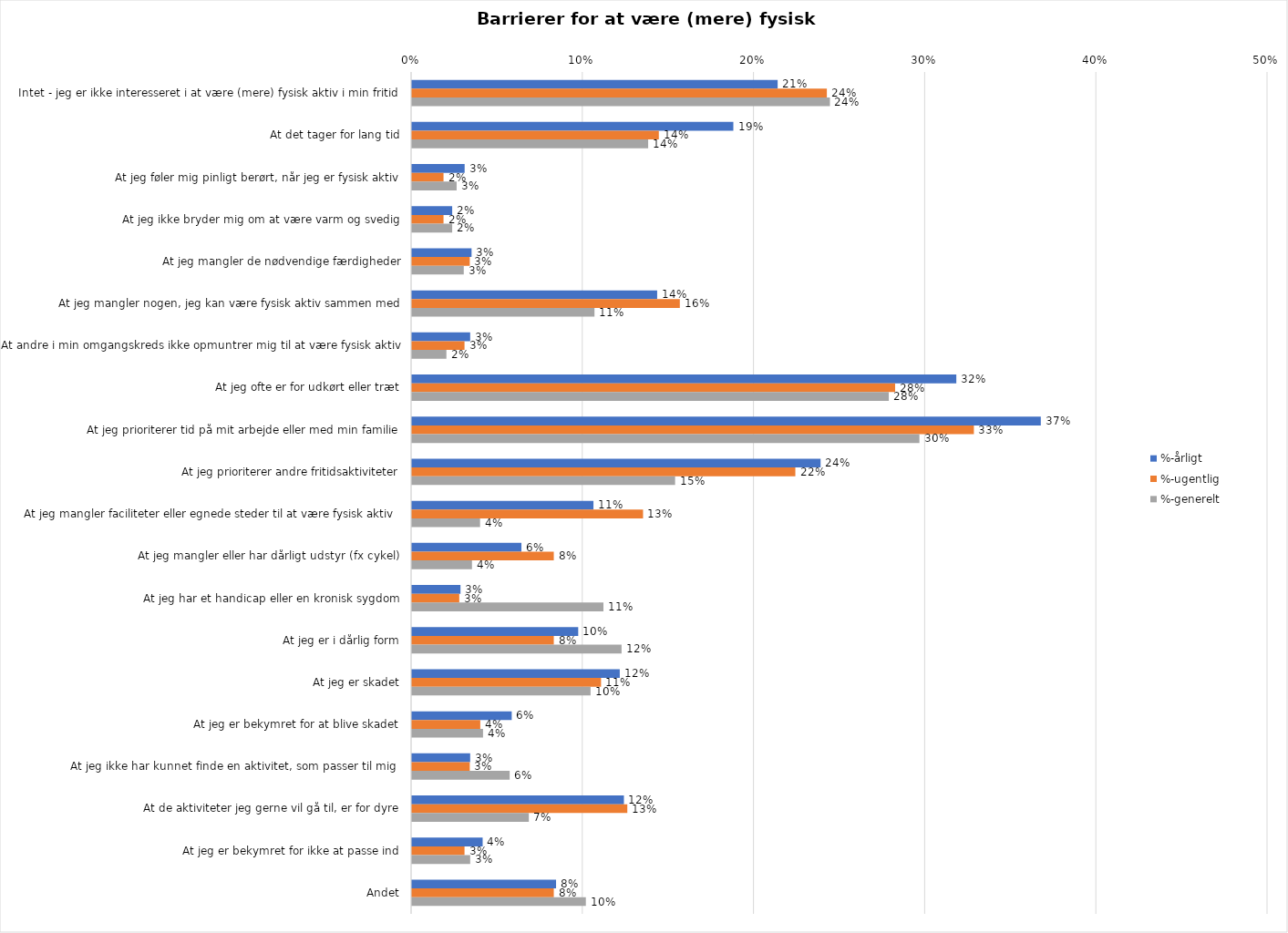
| Category | %-årligt | %-ugentlig | %-generelt |
|---|---|---|---|
| Intet - jeg er ikke interesseret i at være (mere) fysisk aktiv i min fritid | 0.214 | 0.242 | 0.244 |
| At det tager for lang tid | 0.188 | 0.144 | 0.138 |
| At jeg føler mig pinligt berørt, når jeg er fysisk aktiv | 0.031 | 0.018 | 0.026 |
| At jeg ikke bryder mig om at være varm og svedig | 0.023 | 0.018 | 0.023 |
| At jeg mangler de nødvendige færdigheder | 0.035 | 0.034 | 0.03 |
| At jeg mangler nogen, jeg kan være fysisk aktiv sammen med | 0.143 | 0.156 | 0.107 |
| At andre i min omgangskreds ikke opmuntrer mig til at være fysisk aktiv | 0.034 | 0.031 | 0.02 |
| At jeg ofte er for udkørt eller træt | 0.318 | 0.282 | 0.279 |
| At jeg prioriterer tid på mit arbejde eller med min familie | 0.367 | 0.328 | 0.296 |
| At jeg prioriterer andre fritidsaktiviteter | 0.239 | 0.224 | 0.154 |
| At jeg mangler faciliteter eller egnede steder til at være fysisk aktiv  | 0.106 | 0.135 | 0.04 |
| At jeg mangler eller har dårligt udstyr (fx cykel) | 0.064 | 0.083 | 0.035 |
| At jeg har et handicap eller en kronisk sygdom | 0.028 | 0.028 | 0.112 |
| At jeg er i dårlig form | 0.097 | 0.083 | 0.122 |
| At jeg er skadet | 0.121 | 0.11 | 0.104 |
| At jeg er bekymret for at blive skadet | 0.058 | 0.04 | 0.041 |
| At jeg ikke har kunnet finde en aktivitet, som passer til mig  | 0.034 | 0.034 | 0.057 |
| At de aktiviteter jeg gerne vil gå til, er for dyre | 0.124 | 0.126 | 0.068 |
| At jeg er bekymret for ikke at passe ind | 0.041 | 0.031 | 0.034 |
| Andet | 0.084 | 0.083 | 0.102 |